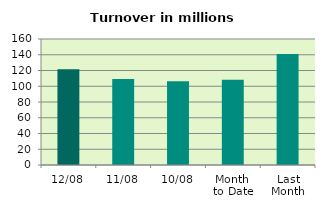
| Category | Series 0 |
|---|---|
| 12/08 | 121.717 |
| 11/08 | 109.202 |
| 10/08 | 106.444 |
| Month 
to Date | 108.256 |
| Last
Month | 140.832 |